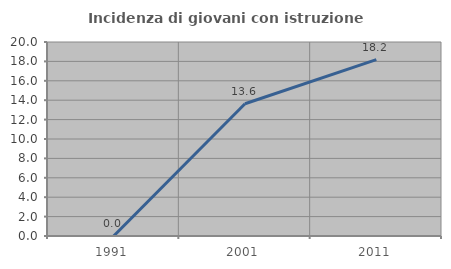
| Category | Incidenza di giovani con istruzione universitaria |
|---|---|
| 1991.0 | 0 |
| 2001.0 | 13.636 |
| 2011.0 | 18.182 |